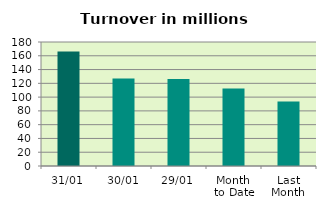
| Category | Series 0 |
|---|---|
| 31/01 | 166.16 |
| 30/01 | 127.142 |
| 29/01 | 126.345 |
| Month 
to Date | 112.571 |
| Last
Month | 93.592 |